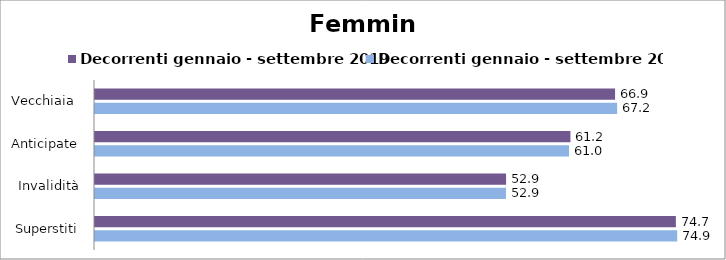
| Category | Decorrenti gennaio - settembre 2019 | Decorrenti gennaio - settembre 2020 |
|---|---|---|
| Vecchiaia  | 66.89 | 67.16 |
| Anticipate | 61.15 | 60.97 |
| Invalidità | 52.87 | 52.86 |
| Superstiti | 74.71 | 74.88 |